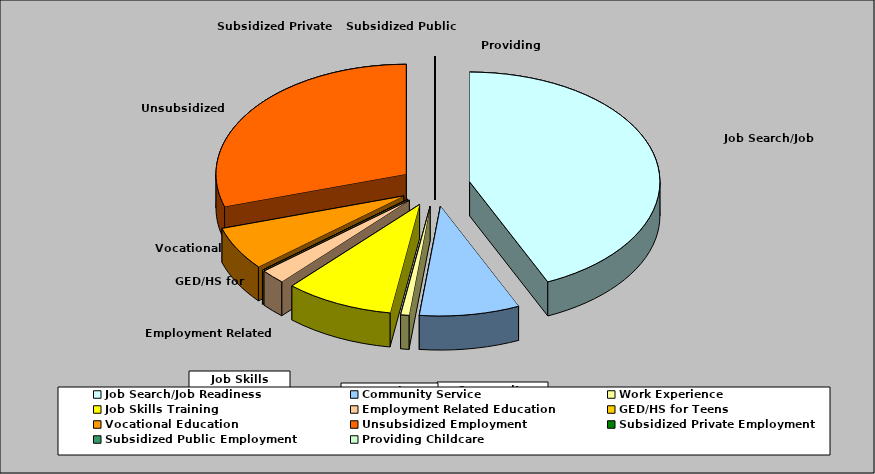
| Category | Series 0 |
|---|---|
| Job Search/Job Readiness | 0.433 |
| Community Service | 0.085 |
| Work Experience | 0.007 |
| Job Skills Training | 0.092 |
| Employment Related Education | 0.021 |
| GED/HS for Teens | 0 |
| Vocational Education | 0.064 |
| Unsubsidized Employment | 0.298 |
| Subsidized Private Employment | 0 |
| Subsidized Public Employment | 0 |
| Providing Childcare | 0 |